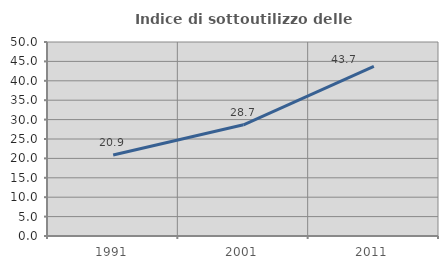
| Category | Indice di sottoutilizzo delle abitazioni  |
|---|---|
| 1991.0 | 20.863 |
| 2001.0 | 28.651 |
| 2011.0 | 43.726 |